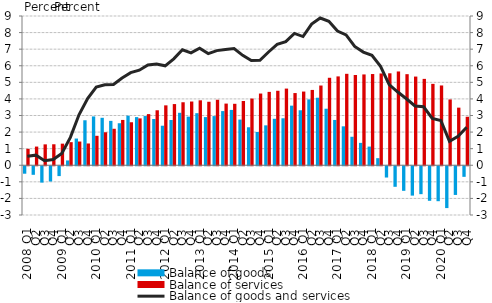
| Category | Balance of goods | Balance of services |
|---|---|---|
| 2008 Q1 | -0.45 | 0.991 |
| Q2 | -0.517 | 1.126 |
| Q3 | -0.986 | 1.26 |
| Q4 | -0.919 | 1.265 |
| 2009 Q1 | -0.594 | 1.303 |
| Q2 | 0.29 | 1.392 |
| Q3 | 1.61 | 1.43 |
| Q4 | 2.713 | 1.313 |
| 2010 Q1 | 2.944 | 1.776 |
| Q2 | 2.862 | 1.99 |
| Q3 | 2.676 | 2.199 |
| Q4 | 2.533 | 2.732 |
| 2011 Q1 | 2.989 | 2.593 |
| Q2 | 2.903 | 2.826 |
| Q3 | 2.968 | 3.084 |
| Q4 | 2.79 | 3.315 |
| 2012 Q1 | 2.384 | 3.612 |
| Q2 | 2.73 | 3.689 |
| Q3 | 3.163 | 3.799 |
| Q4 | 2.932 | 3.843 |
| 2013 Q1 | 3.14 | 3.916 |
| Q2 | 2.903 | 3.829 |
| Q3 | 2.964 | 3.949 |
| Q4 | 3.266 | 3.718 |
| 2014 Q1 | 3.336 | 3.706 |
| Q2 | 2.753 | 3.875 |
| Q3 | 2.29 | 4.023 |
| Q4 | 2.003 | 4.324 |
| 2015 Q1 | 2.406 | 4.424 |
| Q2 | 2.802 | 4.491 |
| Q3 | 2.832 | 4.623 |
| Q4 | 3.594 | 4.353 |
| 2016 Q1 | 3.316 | 4.444 |
| Q2 | 3.971 | 4.542 |
| Q3 | 4.072 | 4.808 |
| Q4 | 3.409 | 5.275 |
| 2017 Q1 | 2.731 | 5.358 |
| Q2 | 2.347 | 5.514 |
| Q3 | 1.718 | 5.443 |
| Q4 | 1.35 | 5.477 |
| 2018 Q1 | 1.126 | 5.5 |
| Q2 | 0.427 | 5.535 |
| Q3 | -0.68 | 5.545 |
| Q4 | -1.239 | 5.655 |
| 2019 Q1 | -1.482 | 5.492 |
| Q2 | -1.771 | 5.348 |
| Q3 | -1.683 | 5.208 |
| Q4 | -2.084 | 4.908 |
| 2020 Q1 | -2.108 | 4.811 |
| Q2 | -2.522 | 3.968 |
| Q3 | -1.73 | 3.474 |
| Q4 | -0.638 | 2.925 |